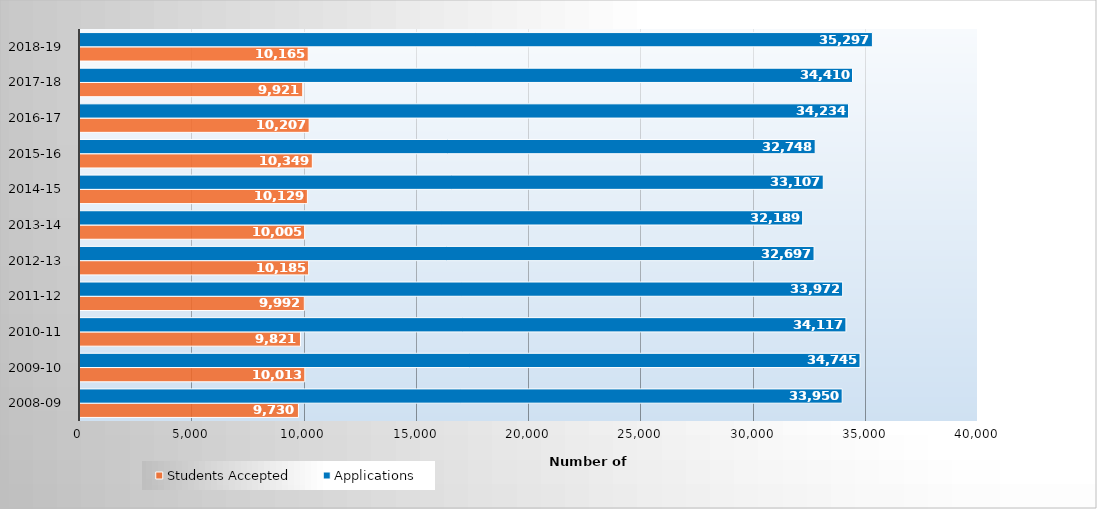
| Category | Students Accepted | Applications |
|---|---|---|
| 2008-09 | 9730 | 33950 |
| 2009-10 | 10013 | 34745 |
| 2010-11 | 9821 | 34117 |
| 2011-12 | 9992 | 33972 |
| 2012-13 | 10185 | 32697 |
| 2013-14 | 10005 | 32189 |
| 2014-15 | 10129 | 33107 |
| 2015-16 | 10349 | 32748 |
| 2016-17 | 10207 | 34234 |
| 2017-18 | 9921 | 34410 |
| 2018-19 | 10165 | 35297 |